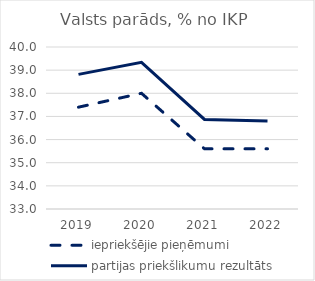
| Category | iepriekšējie pieņēmumi | partijas priekšlikumu rezultāts |
|---|---|---|
| 2019.0 | 37.4 | 38.816 |
| 2020.0 | 38 | 39.339 |
| 2021.0 | 35.6 | 36.87 |
| 2022.0 | 35.6 | 36.805 |